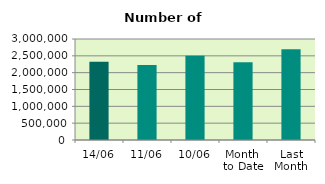
| Category | Series 0 |
|---|---|
| 14/06 | 2322622 |
| 11/06 | 2231128 |
| 10/06 | 2502762 |
| Month 
to Date | 2310566.2 |
| Last
Month | 2692139.333 |